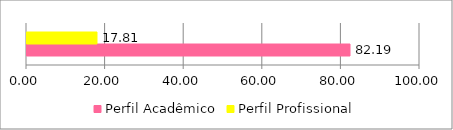
| Category | Perfil Acadêmico | Perfil Profissional |
|---|---|---|
| 0 | 82.192 | 17.808 |